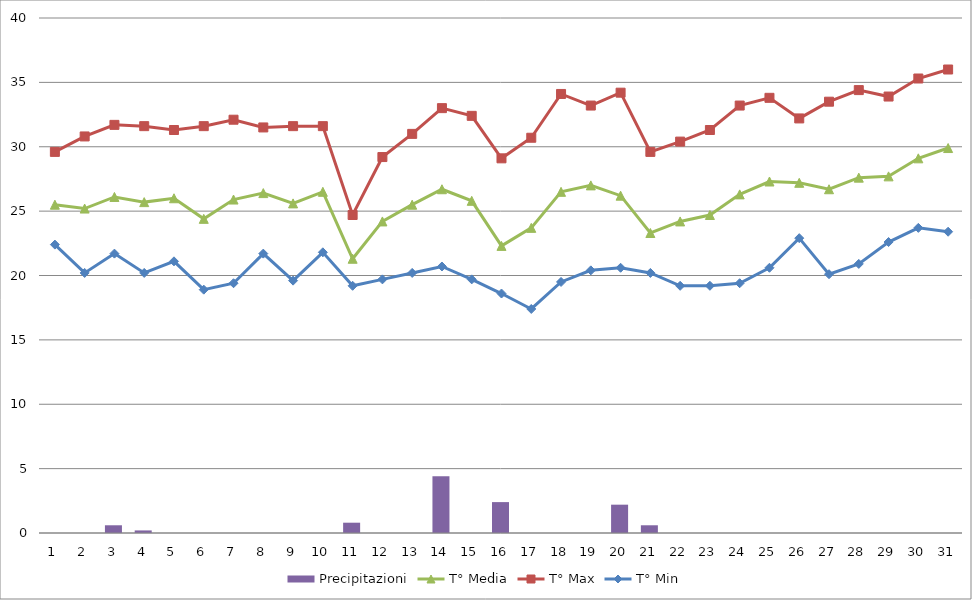
| Category | Precipitazioni |
|---|---|
| 0 | 0 |
| 1 | 0 |
| 2 | 0.6 |
| 3 | 0.2 |
| 4 | 0 |
| 5 | 0 |
| 6 | 0 |
| 7 | 0 |
| 8 | 0 |
| 9 | 0 |
| 10 | 0.8 |
| 11 | 0 |
| 12 | 0 |
| 13 | 4.4 |
| 14 | 0 |
| 15 | 2.4 |
| 16 | 0 |
| 17 | 0 |
| 18 | 0 |
| 19 | 2.2 |
| 20 | 0.6 |
| 21 | 0 |
| 22 | 0 |
| 23 | 0 |
| 24 | 0 |
| 25 | 0 |
| 26 | 0 |
| 27 | 0 |
| 28 | 0 |
| 29 | 0 |
| 30 | 0 |